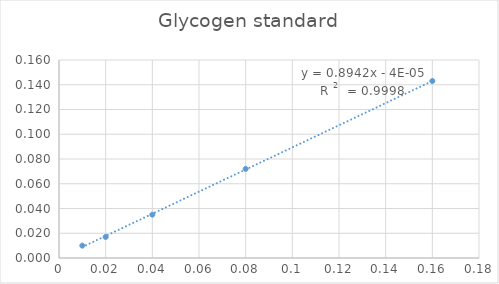
| Category | Series 0 |
|---|---|
| 0.01 | 0.01 |
| 0.02 | 0.017 |
| 0.04 | 0.035 |
| 0.08 | 0.072 |
| 0.16 | 0.143 |